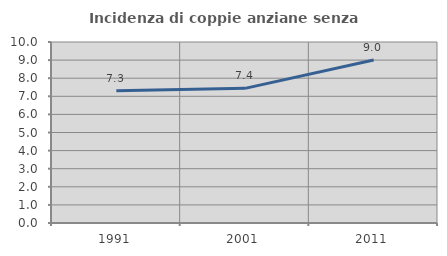
| Category | Incidenza di coppie anziane senza figli  |
|---|---|
| 1991.0 | 7.304 |
| 2001.0 | 7.439 |
| 2011.0 | 9.008 |